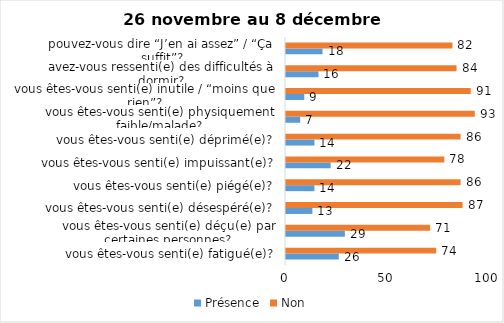
| Category | Présence | Non |
|---|---|---|
| vous êtes-vous senti(e) fatigué(e)? | 26 | 74 |
| vous êtes-vous senti(e) déçu(e) par certaines personnes? | 29 | 71 |
| vous êtes-vous senti(e) désespéré(e)? | 13 | 87 |
| vous êtes-vous senti(e) piégé(e)? | 14 | 86 |
| vous êtes-vous senti(e) impuissant(e)? | 22 | 78 |
| vous êtes-vous senti(e) déprimé(e)? | 14 | 86 |
| vous êtes-vous senti(e) physiquement faible/malade? | 7 | 93 |
| vous êtes-vous senti(e) inutile / “moins que rien”? | 9 | 91 |
| avez-vous ressenti(e) des difficultés à dormir? | 16 | 84 |
| pouvez-vous dire “J’en ai assez” / “Ça suffit”? | 18 | 82 |